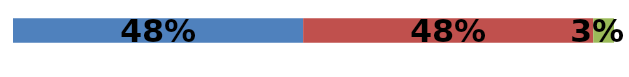
| Category | Series 0 | Series 1 | Series 2 |
|---|---|---|---|
| 0 | 0.483 | 0.483 | 0.034 |